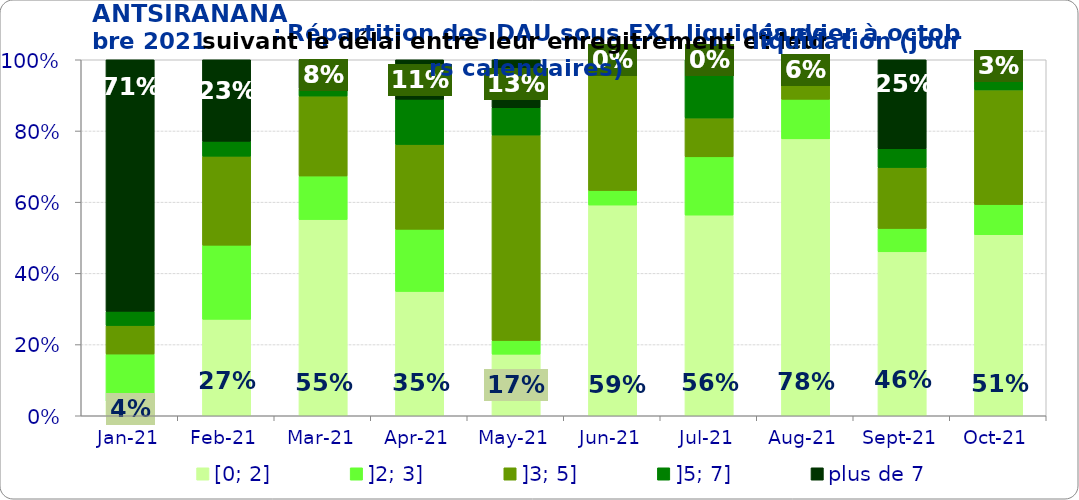
| Category | [0; 2] | ]2; 3] | ]3; 5] | ]5; 7] | plus de 7 |
|---|---|---|---|---|---|
| 2021-01-01 | 0.04 | 0.133 | 0.08 | 0.04 | 0.707 |
| 2021-02-01 | 0.271 | 0.208 | 0.25 | 0.042 | 0.229 |
| 2021-03-01 | 0.551 | 0.122 | 0.224 | 0.02 | 0.082 |
| 2021-04-01 | 0.349 | 0.175 | 0.238 | 0.127 | 0.111 |
| 2021-05-01 | 0.173 | 0.038 | 0.577 | 0.077 | 0.135 |
| 2021-06-01 | 0.592 | 0.041 | 0.367 | 0 | 0 |
| 2021-07-01 | 0.564 | 0.164 | 0.109 | 0.164 | 0 |
| 2021-08-01 | 0.778 | 0.111 | 0.056 | 0 | 0.056 |
| 2021-09-01 | 0.461 | 0.066 | 0.171 | 0.053 | 0.25 |
| 2021-10-01 | 0.508 | 0.085 | 0.322 | 0.051 | 0.034 |